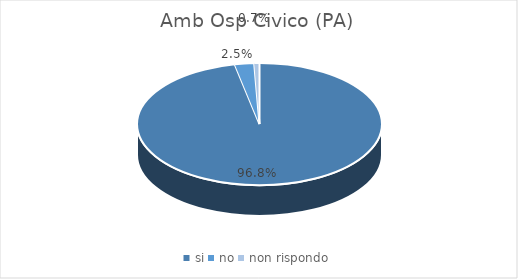
| Category | Amb Osp Civico (PA) |
|---|---|
| si | 0.968 |
| no | 0.025 |
| non rispondo | 0.007 |